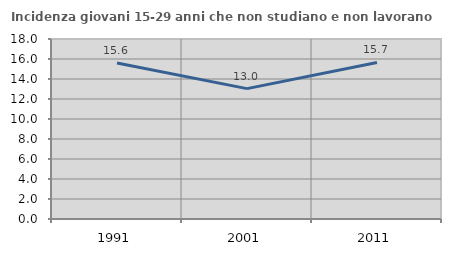
| Category | Incidenza giovani 15-29 anni che non studiano e non lavorano  |
|---|---|
| 1991.0 | 15.594 |
| 2001.0 | 13.035 |
| 2011.0 | 15.654 |